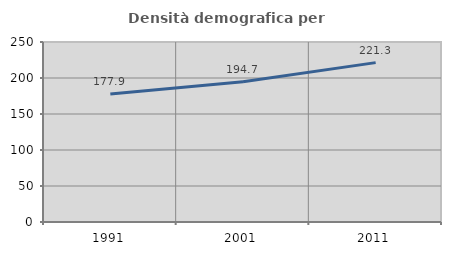
| Category | Densità demografica |
|---|---|
| 1991.0 | 177.862 |
| 2001.0 | 194.744 |
| 2011.0 | 221.347 |